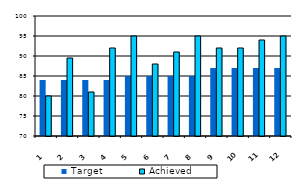
| Category | Target | Achieved  |
|---|---|---|
| 0 | 84 | 80 |
| 1 | 84 | 89.5 |
| 2 | 84 | 81 |
| 3 | 84 | 92 |
| 4 | 85 | 95 |
| 5 | 85 | 88 |
| 6 | 85 | 91 |
| 7 | 85 | 95 |
| 8 | 87 | 92 |
| 9 | 87 | 92 |
| 10 | 87 | 94 |
| 11 | 87 | 95 |